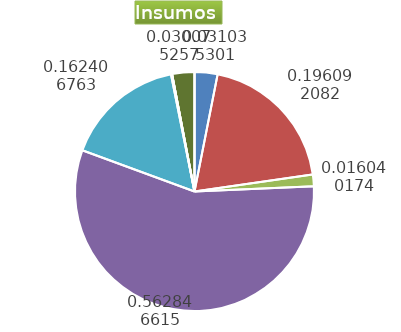
| Category | Series 0 |
|---|---|
| Control arvenses | 138521 |
| Control fitosanitario | 875225 |
| Cosecha y beneficio | 71592.699 |
| Fertilización | 2512174 |
| Instalación | 724876.081 |
| Otros | 6712 |
| Podas | 0 |
| Riego | 0 |
| Transporte | 134236 |
| Tutorado | 0 |